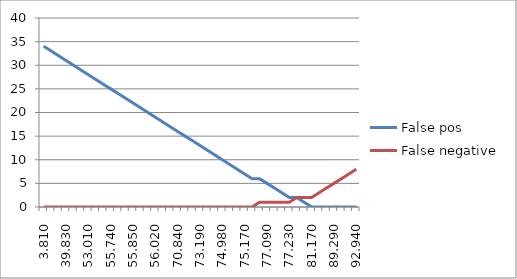
| Category | False pos | False negative |
|---|---|---|
| 3.810 | 34 | 0 |
| 3.810 | 33 | 0 |
| 37.450 | 32 | 0 |
| 39.830 | 31 | 0 |
| 40.310 | 30 | 0 |
| 41.640 | 29 | 0 |
| 53.010 | 28 | 0 |
| 55.030 | 27 | 0 |
| 55.500 | 26 | 0 |
| 55.740 | 25 | 0 |
| 55.850 | 24 | 0 |
| 55.850 | 23 | 0 |
| 55.850 | 22 | 0 |
| 55.870 | 21 | 0 |
| 55.900 | 20 | 0 |
| 56.020 | 19 | 0 |
| 56.520 | 18 | 0 |
| 70.420 | 17 | 0 |
| 70.840 | 16 | 0 |
| 70.850 | 15 | 0 |
| 73.040 | 14 | 0 |
| 73.190 | 13 | 0 |
| 73.190 | 12 | 0 |
| 73.460 | 11 | 0 |
| 74.980 | 10 | 0 |
| 75.170 | 9 | 0 |
| 75.170 | 8 | 0 |
| 75.170 | 7 | 0 |
| 76.180 | 6 | 0 |
| 76.290 | 6 | 1 |
| 77.090 | 5 | 1 |
| 77.090 | 4 | 1 |
| 77.090 | 3 | 1 |
| 77.230 | 2 | 1 |
| 79.120 | 2 | 2 |
| 79.120 | 1 | 2 |
| 81.170 | 0 | 2 |
| 86.920 | 0 | 3 |
| 88.720 | 0 | 4 |
| 89.290 | 0 | 5 |
| 91.610 | 0 | 6 |
| 92.320 | 0 | 7 |
| 92.940 | 0 | 8 |